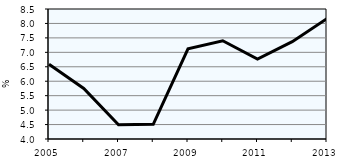
| Category | PODÍL NEZAMĚSTNANÝCH OSOB |
|---|---|
| 2005.0 | 6.59 |
| 2006.0 | 5.75 |
| 2007.0 | 4.49 |
| 2008.0 | 4.51 |
| 2009.0 | 7.12 |
| 2010.0 | 7.4 |
| 2011.0 | 6.77 |
| 2012.0 | 7.37 |
| 2013.0 | 8.17 |